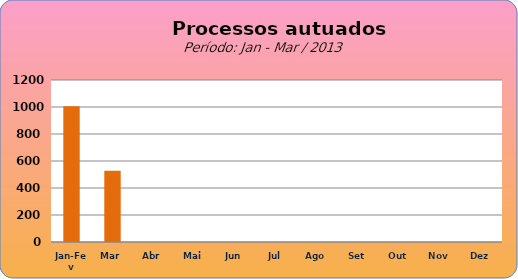
| Category | 1006 | 527 |
|---|---|---|
| Jan-Fev | 1006 |  |
| Mar | 527 |  |
| Abr | 0 |  |
| Mai | 0 |  |
| Jun | 0 |  |
| Jul | 0 |  |
| Ago | 0 |  |
| Set | 0 |  |
| Out | 0 |  |
| Nov | 0 |  |
| Dez | 0 |  |